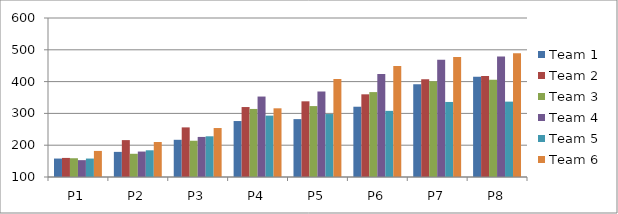
| Category | Team 1 | Team 2 | Team 3 | Team 4 | Team 5 | Team 6 |
|---|---|---|---|---|---|---|
| P1 | 158 | 160 | 159 | 153 | 158 | 182 |
| P2 | 179 | 216 | 173 | 180 | 184 | 210 |
| P3 | 217 | 256 | 214 | 226 | 228 | 254 |
| P4 | 276 | 320 | 314 | 353 | 293 | 316 |
| P5 | 282 | 338 | 323 | 369 | 298 | 408 |
| P6 | 321 | 360 | 367 | 424 | 308 | 449 |
| P7 | 392 | 407 | 401 | 469 | 336 | 477 |
| P8 | 415 | 418 | 406 | 479 | 337 | 489 |